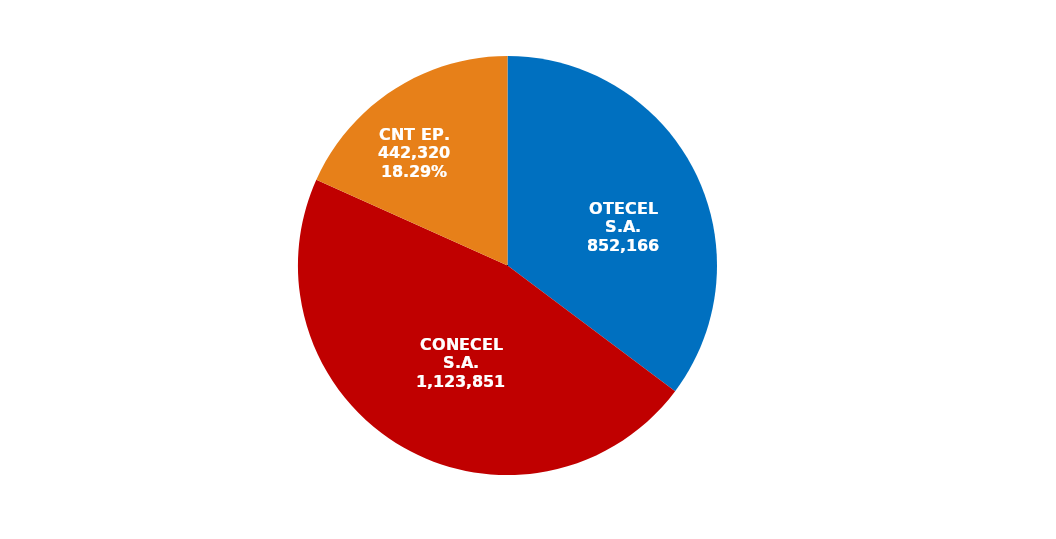
| Category | Series 0 |
|---|---|
| OTECEL S.A. | 852166 |
| CONECEL S.A. | 1123851 |
| CNT EP. | 442320 |